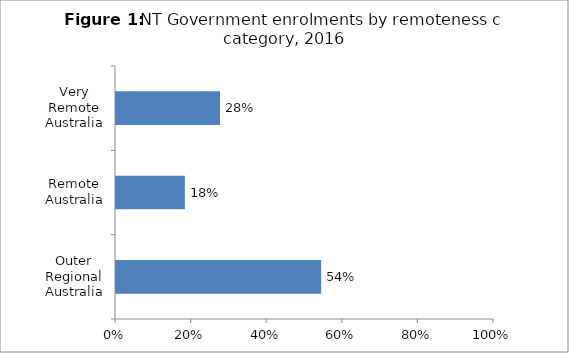
| Category | % |
|---|---|
| Outer Regional Australia | 0.543 |
| Remote Australia | 0.182 |
| Very Remote Australia | 0.275 |